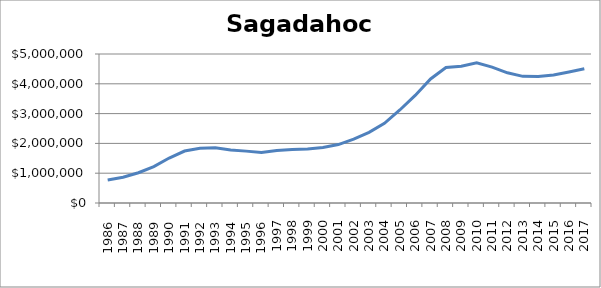
| Category | Sagadahoc (000s) |
|---|---|
|       1986 | 773050 |
|       1987 | 865550 |
|       1988 | 1015150 |
|       1989 | 1222750 |
|       1990 | 1508950 |
|       1991 | 1744400 |
|       1992 | 1833950 |
|       1993 | 1851150 |
|       1994 | 1775200 |
|       1995 | 1740700 |
|       1996 | 1697000 |
| 1997 | 1764500 |
| 1998 | 1794650 |
| 1999 | 1812050 |
| 2000 | 1860350 |
| 2001 | 1961700 |
| 2002 | 2142750 |
| 2003 | 2370500 |
| 2004 | 2674700 |
| 2005 | 3120800 |
| 2006 | 3608800 |
| 2007 | 4161650 |
| 2008 | 4544550 |
| 2009 | 4592600 |
| 2010 | 4704200 |
| 2011 | 4558500 |
| 2012 | 4369500 |
| 2013 | 4249550 |
| 2014 | 4246900 |
| 2015 | 4295950 |
| 2016 | 4396950 |
| 2017 | 4507750 |